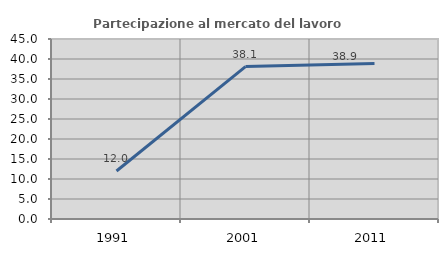
| Category | Partecipazione al mercato del lavoro  femminile |
|---|---|
| 1991.0 | 12 |
| 2001.0 | 38.095 |
| 2011.0 | 38.889 |